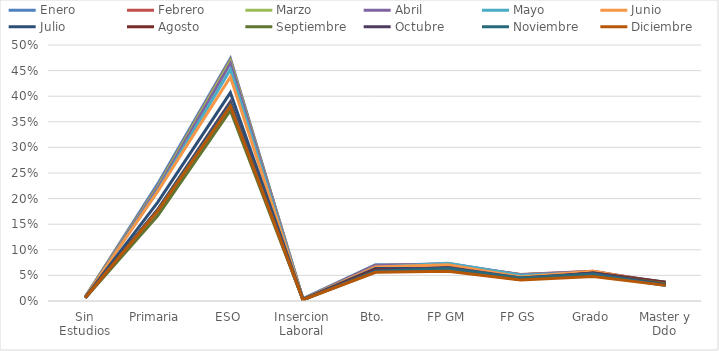
| Category | Enero | Febrero | Marzo | Abril | Mayo | Junio | Julio | Agosto | Septiembre | Octubre | Noviembre | Diciembre |
|---|---|---|---|---|---|---|---|---|---|---|---|---|
| Sin Estudios | 0.008 | 0.008 | 0.008 | 0.008 | 0.007 | 0.007 | 0.007 | 0.006 | 0.006 | 0.006 | 0.007 | 0.006 |
| Primaria | 0.229 | 0.224 | 0.223 | 0.22 | 0.215 | 0.214 | 0.193 | 0.179 | 0.167 | 0.179 | 0.178 | 0.176 |
| ESO | 0.473 | 0.47 | 0.469 | 0.464 | 0.452 | 0.438 | 0.407 | 0.383 | 0.372 | 0.389 | 0.384 | 0.381 |
| Insercion Laboral | 0.004 | 0.004 | 0.004 | 0.004 | 0.004 | 0.003 | 0.003 | 0.003 | 0.002 | 0.003 | 0.002 | 0.002 |
| Bto. | 0.071 | 0.07 | 0.069 | 0.069 | 0.066 | 0.066 | 0.063 | 0.061 | 0.057 | 0.059 | 0.058 | 0.056 |
| FP GM | 0.07 | 0.071 | 0.072 | 0.073 | 0.074 | 0.071 | 0.063 | 0.059 | 0.06 | 0.065 | 0.064 | 0.058 |
| FP GS | 0.051 | 0.052 | 0.051 | 0.051 | 0.05 | 0.047 | 0.043 | 0.042 | 0.042 | 0.045 | 0.045 | 0.041 |
| Grado | 0.056 | 0.058 | 0.057 | 0.058 | 0.056 | 0.058 | 0.055 | 0.054 | 0.053 | 0.054 | 0.053 | 0.048 |
| Master y Ddo | 0.037 | 0.035 | 0.035 | 0.034 | 0.033 | 0.034 | 0.036 | 0.037 | 0.034 | 0.032 | 0.03 | 0.031 |